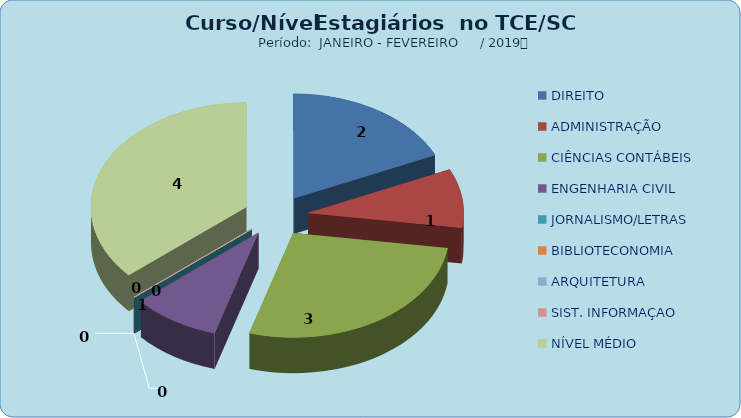
| Category | Series 0 |
|---|---|
| DIREITO | 2 |
| ADMINISTRAÇÃO | 1 |
| CIÊNCIAS CONTÁBEIS | 3 |
| ENGENHARIA CIVIL | 1 |
| JORNALISMO/LETRAS | 0 |
| BIBLIOTECONOMIA | 0 |
| ARQUITETURA | 0 |
| SIST. INFORMAÇAO | 0 |
| NÍVEL MÉDIO | 4 |